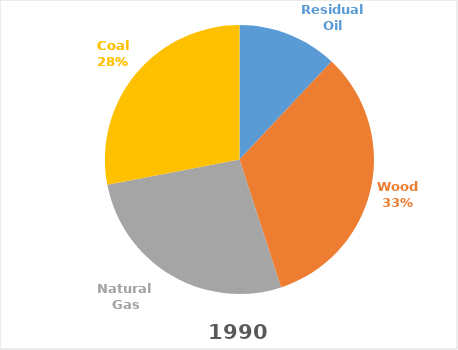
| Category | 1990 | 2010 |
|---|---|---|
| Residual Oil | 12 | 1 |
| Wood | 33 | 44 |
| Natural Gas | 27 | 27 |
| Coal | 28 | 28 |